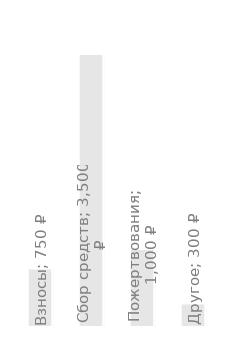
| Category | Годовой доход |
|---|---|
| Взносы | 750 |
| Сбор средств | 3500 |
| Пожертвования | 1000 |
| Другое | 300 |